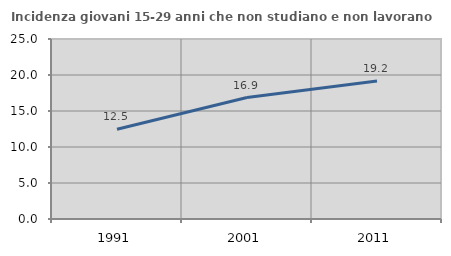
| Category | Incidenza giovani 15-29 anni che non studiano e non lavorano  |
|---|---|
| 1991.0 | 12.462 |
| 2001.0 | 16.875 |
| 2011.0 | 19.167 |